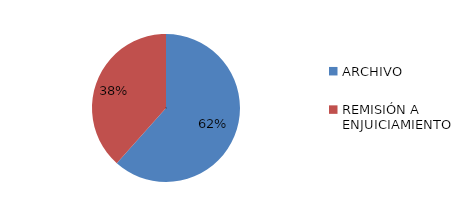
| Category | Series 0 |
|---|---|
| ARCHIVO | 109 |
| REMISIÓN A ENJUICIAMIENTO | 68 |